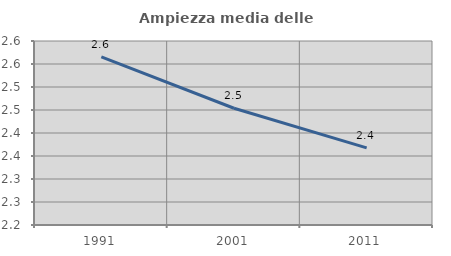
| Category | Ampiezza media delle famiglie |
|---|---|
| 1991.0 | 2.565 |
| 2001.0 | 2.454 |
| 2011.0 | 2.368 |